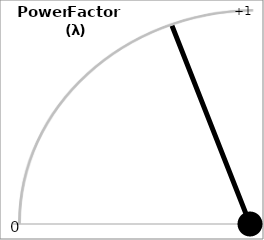
| Category | Series 0 |
|---|---|
| 0.0 | 0 |
| -0.3292236228433251 | 0.944 |